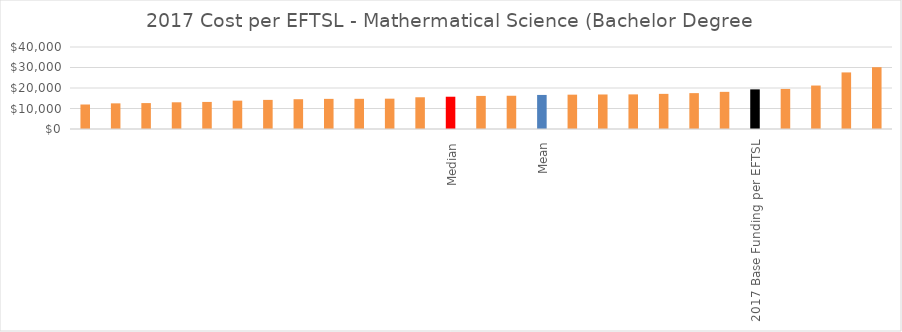
| Category | Series 0 |
|---|---|
|  | 11952.176 |
|  | 12511.379 |
|  | 12642.843 |
|  | 13030.657 |
|  | 13202.988 |
|  | 13829.123 |
|  | 14201.616 |
|  | 14529.27 |
|  | 14700.71 |
|  | 14722.558 |
|  | 14793.653 |
|  | 15479.901 |
| Median | 15742.337 |
|  | 16138.364 |
|  | 16219.417 |
| Mean | 16617 |
|  | 16746.415 |
|  | 16836.815 |
|  | 16880.906 |
|  | 17136.523 |
|  | 17500.289 |
|  | 18118.253 |
| 2017 Base Funding per EFTSL | 19328 |